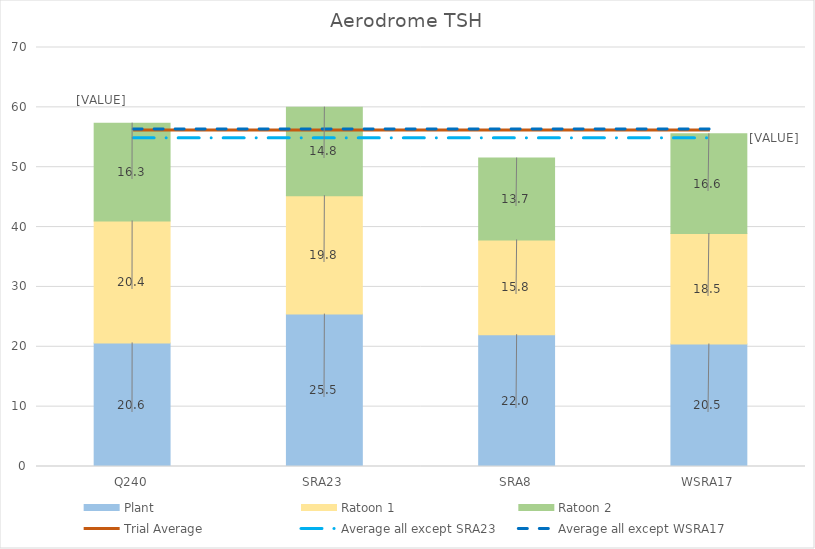
| Category | Plant | Ratoon 1 | Ratoon 2 |
|---|---|---|---|
| Q240 | 20.647 | 20.367 | 16.349 |
| SRA23 | 25.459 | 19.781 | 14.791 |
| SRA8 | 22.011 | 15.846 | 13.679 |
| WSRA17 | 20.461 | 18.461 | 16.65 |